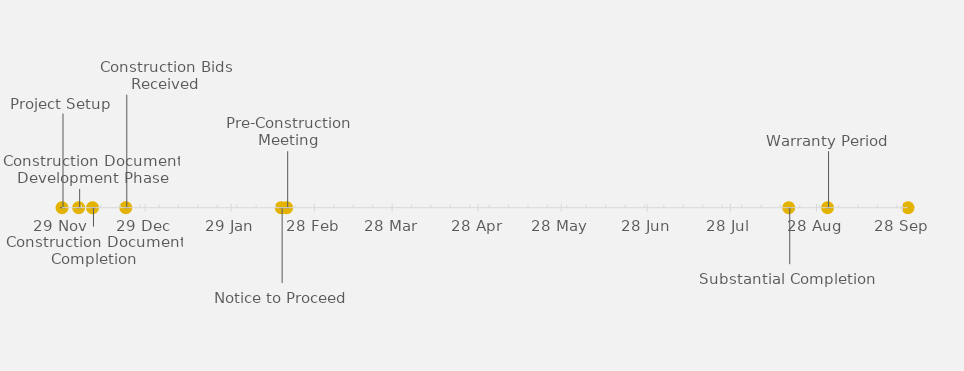
| Category | POSITION |
|---|---|
| Project Setup | 25 |
| Construction Document Development Phase | 5 |
| Construction Document Completion | -5 |
| Construction Bids Received | 30 |
| Notice to Proceed | -20 |
| Pre-Construction Meeting | 15 |
| Substantial Completion  | -15 |
| Warranty Period | 15 |
| Project End | -20 |